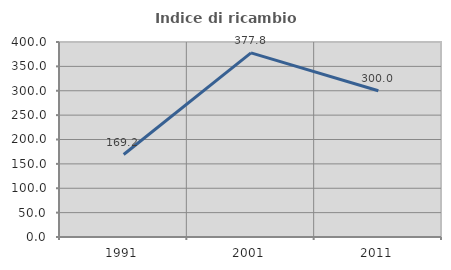
| Category | Indice di ricambio occupazionale  |
|---|---|
| 1991.0 | 169.231 |
| 2001.0 | 377.778 |
| 2011.0 | 300 |